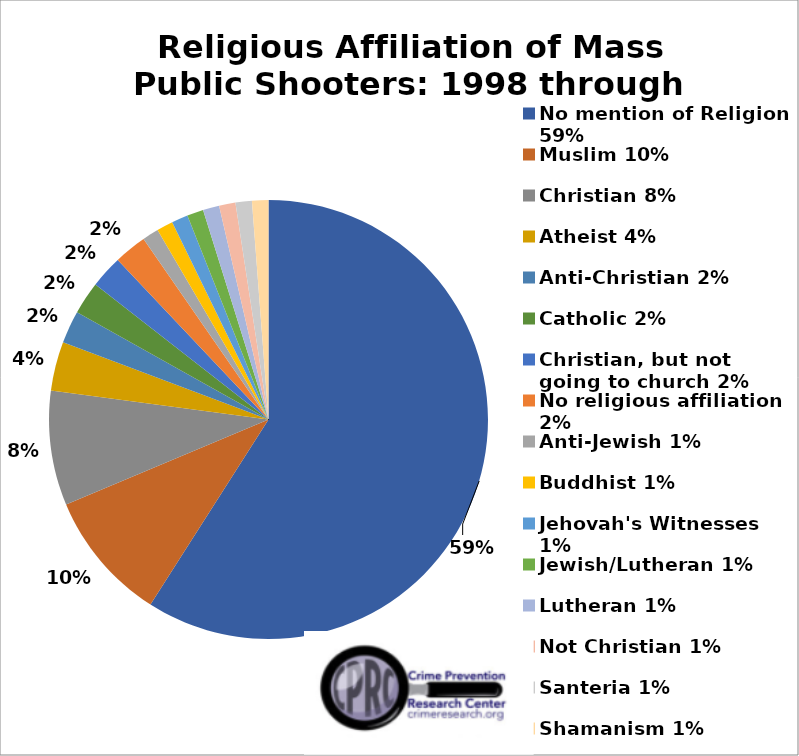
| Category | Series 1 |
|---|---|
| No mention of Religion 59% | 0.59 |
| Muslim 10% | 0.096 |
| Christian 8% | 0.084 |
| Atheist 4% | 0.036 |
| Anti-Christian 2% | 0.024 |
| Catholic 2% | 0.024 |
| Christian, but not going to church 2% | 0.024 |
| No religious affiliation 2% | 0.024 |
| Anti-Jewish 1% | 0.012 |
| Buddhist 1% | 0.012 |
| Jehovah's Witnesses 1% | 0.012 |
| Jewish/Lutheran 1% | 0.012 |
| Lutheran 1% | 0.012 |
| Not Christian 1% | 0.012 |
| Santeria 1% | 0.012 |
| Shamanism 1% | 0.012 |